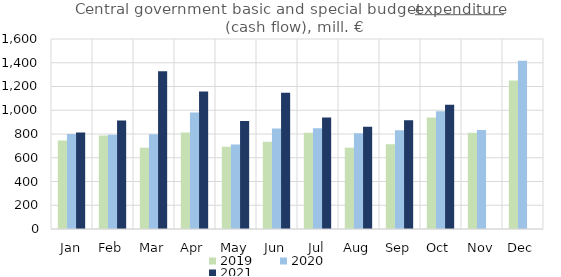
| Category | 2019 | 2020 | 2021 |
|---|---|---|---|
| Jan | 744762.553 | 800513.176 | 812540.784 |
| Feb | 788151.459 | 793560.967 | 913452.191 |
| Mar | 684867.842 | 796946.618 | 1329058.335 |
| Apr | 812009.505 | 981781.839 | 1156902.965 |
| May | 692731.33 | 711775.073 | 909621.75 |
| Jun | 735400.311 | 846260.327 | 1146703.878 |
| Jul | 811362.713 | 848728.248 | 939467.851 |
| Aug | 684714.824 | 805848.679 | 860719.856 |
| Sep | 714096.479 | 832590.985 | 915890.517 |
| Oct | 938491.259 | 990572.907 | 1045656.477 |
| Nov | 810141.17 | 834311.145 | 0 |
| Dec | 1250198.681 | 1416800.012 | 0 |